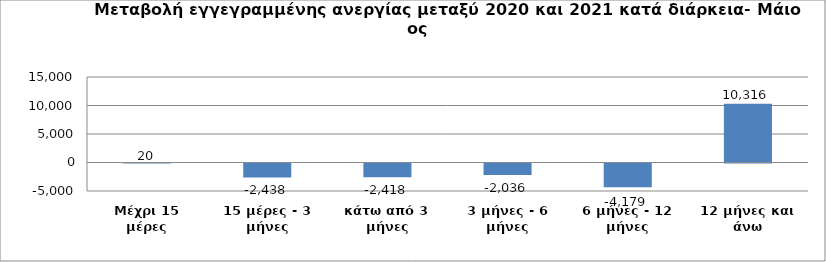
| Category | Series 0 |
|---|---|
| Μέχρι 15 μέρες | 20 |
| 15 μέρες - 3 μήνες | -2438 |
| κάτω από 3 μήνες | -2418 |
| 3 μήνες - 6 μήνες | -2036 |
| 6 μήνες - 12 μήνες | -4179 |
| 12 μήνες και άνω | 10316 |